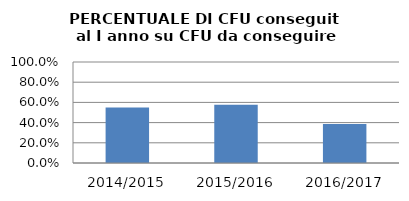
| Category | 2014/2015 2015/2016 2016/2017 |
|---|---|
| 2014/2015 | 0.549 |
| 2015/2016 | 0.578 |
| 2016/2017 | 0.386 |